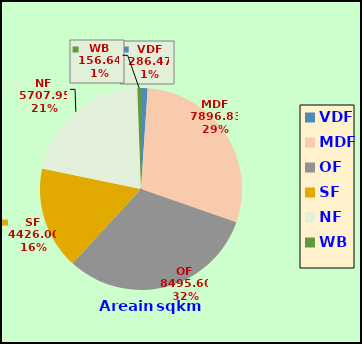
| Category | Series 0 |
|---|---|
| VDF | 286.47 |
| MDF | 7896.83 |
| OF | 8495.6 |
| SF | 4426 |
| NF | 5707.95 |
| WB | 156.64 |